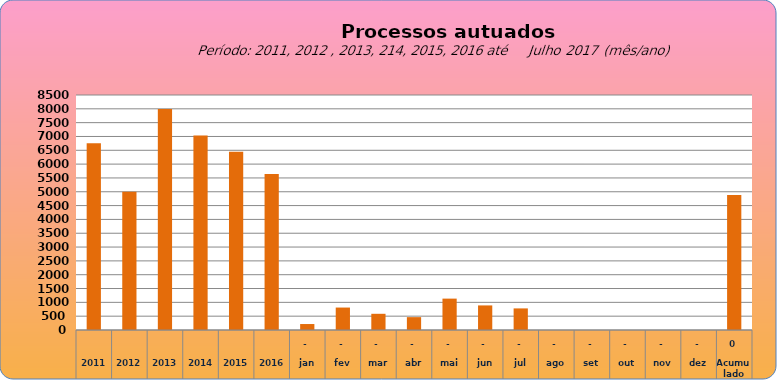
| Category | 6755 |
|---|---|
| 2011 | 6755 |
| 2012 | 4997 |
| 2013 | 7990 |
| 2014 | 7034 |
| 2015 | 6446 |
| 2016 | 5644 |
| jan | 216 |
| fev | 812 |
| mar | 586 |
| abr | 465 |
| mai | 1135 |
| jun | 889 |
| jul | 781 |
| ago | 0 |
| set | 0 |
| out | 0 |
| nov | 0 |
| dez | 0 |
| Acumulado
 | 4884 |